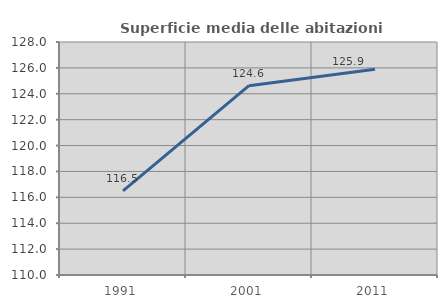
| Category | Superficie media delle abitazioni occupate |
|---|---|
| 1991.0 | 116.496 |
| 2001.0 | 124.629 |
| 2011.0 | 125.9 |